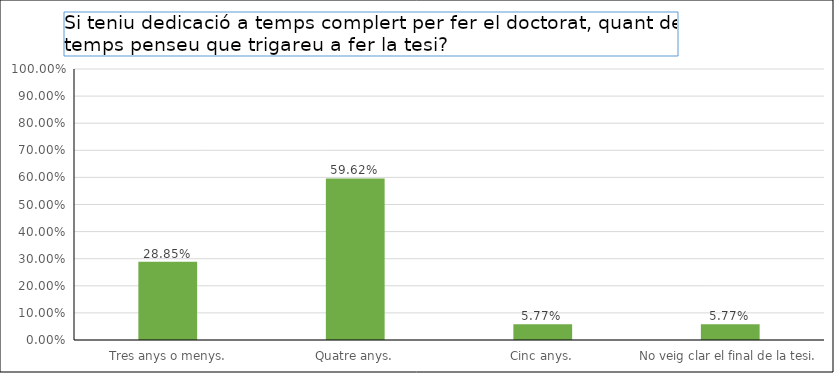
| Category | Series 0 |
|---|---|
|  Tres anys o menys. | 0.288 |
| Quatre anys. | 0.596 |
| Cinc anys. | 0.058 |
| No veig clar el final de la tesi. | 0.058 |